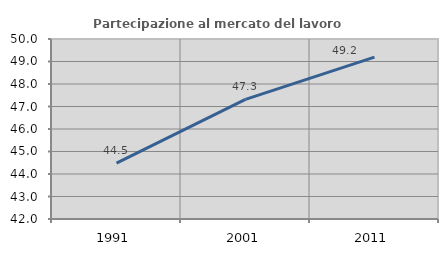
| Category | Partecipazione al mercato del lavoro  femminile |
|---|---|
| 1991.0 | 44.488 |
| 2001.0 | 47.319 |
| 2011.0 | 49.197 |